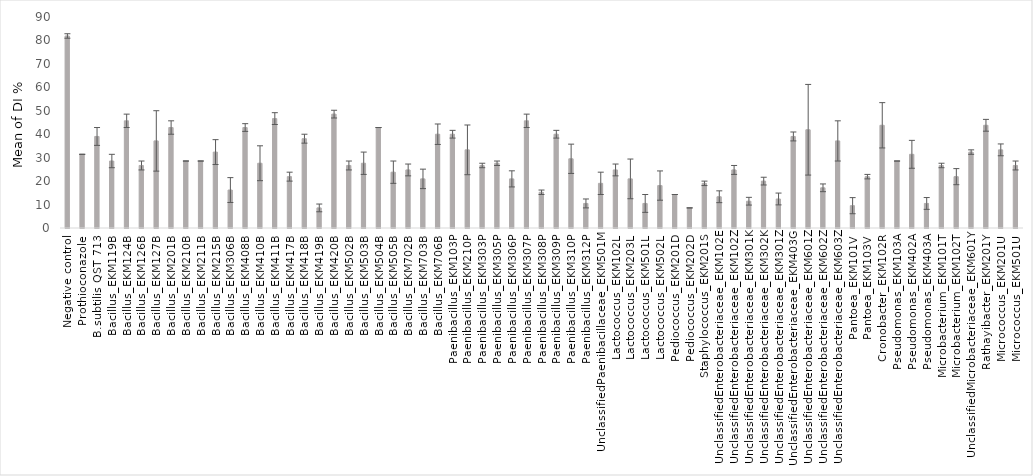
| Category | Series 0 |
|---|---|
| Negative control | 81.905 |
| Prothioconazole | 31.429 |
| B.subtilis QST 713 | 39.048 |
| Bacillus_EKM119B | 28.571 |
| Bacillus_EKM124B | 45.714 |
| Bacillus_EKM126B | 26.667 |
| Bacillus_EKM127B | 37.143 |
| Bacillus_EKM201B | 42.857 |
| Bacillus_EKM210B | 28.571 |
| Bacillus_EKM211B | 28.571 |
| Bacillus_EKM215B | 32.381 |
| Bacillus_EKM306B | 16.19 |
| Bacillus_EKM408B | 42.857 |
| Bacillus_EKM410B | 27.619 |
| Bacillus_EKM411B | 46.667 |
| Bacillus_EKM417B | 21.905 |
| Bacillus_EKM418B | 38.095 |
| Bacillus_EKM419B | 8.571 |
| Bacillus_EKM420B | 48.571 |
| Bacillus_EKM502B | 26.667 |
| Bacillus_EKM503B | 27.619 |
| Bacillus_EKM504B | 42.857 |
| Bacillus_EKM505B | 23.81 |
| Bacillus_EKM702B | 24.762 |
| Bacillus_EKM703B | 20.952 |
| Bacillus_EKM706B | 40 |
| Paenibacillus_EKM103P | 40 |
| Paenibacillus_EKM210P | 33.333 |
| Paenibacillus_EKM303P | 26.667 |
| Paenibacillus_EKM305P | 27.619 |
| Paenibacillus_EKM306P | 20.952 |
| Paenibacillus_EKM307P | 45.714 |
| Paenibacillus_EKM308P | 15.238 |
| Paenibacillus_EKM309P | 40 |
| Paenibacillus_EKM310P | 29.524 |
| Paenibacillus_EKM312P | 10.476 |
| UnclassifiedPaenibacillaceae_EKM501M | 19.048 |
| Lactococcus_EKM102L | 24.762 |
| Lactococcus_EKM203L | 20.952 |
| Lactococcus_EKM501L | 10.476 |
| Lactococcus_EKM502L | 18.095 |
| Pediococcus_EKM201D | 14.286 |
| Pediococcus_EKM202D | 8.571 |
| Staphylococcus_EKM201S | 19.048 |
| UnclassifiedEnterobacteriaceae_EKM102E | 13.333 |
| UnclassifiedEnterobacteriaceae_EKM102Z | 24.762 |
| UnclassifiedEnterobacteriaceae_EKM301K | 11.429 |
| UnclassifiedEnterobacteriaceae_EKM302K | 20 |
| UnclassifiedEnterobacteriaceae_EKM301Z | 12.381 |
| UnclassifiedEnterobacteriaceae_EKM403G | 39.048 |
| UnclassifiedEnterobacteriaceae_EKM601Z | 41.905 |
| UnclassifiedEnterobacteriaceae_EKM602Z | 17.143 |
| UnclassifiedEnterobacteriaceae_EKM603Z | 37.143 |
| Pantoea_EKM101V | 9.524 |
| Pantoea_EKM103V | 21.905 |
| Cronobacter_EKM102R | 43.81 |
| Pseudomonas_EKM103A | 28.571 |
| Pseudomonas_EKM402A | 31.429 |
| Pseudomonas_EKM403A | 10.476 |
| Microbacterium_EKM101T | 26.667 |
| Microbacterium_EKM102T | 21.905 |
| UnclassifiedMicrobacteriaceae_EKM601Y | 32.381 |
| Rathayibacter_EKM201Y | 43.81 |
| Micrococcus_EKM201U | 33.333 |
| Micrococcus_EKM501U | 26.667 |